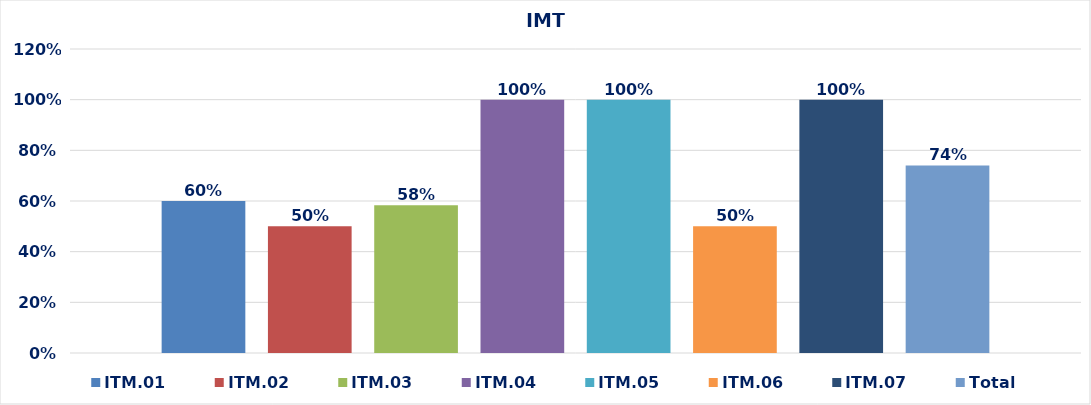
| Category | ITM.01 | ITM.02 | ITM.03 | ITM.04 | ITM.05 | ITM.06 | ITM.07 | Total |
|---|---|---|---|---|---|---|---|---|
| 0 | 0.6 | 0.5 | 0.583 | 1 | 1 | 0.5 | 1 | 0.74 |